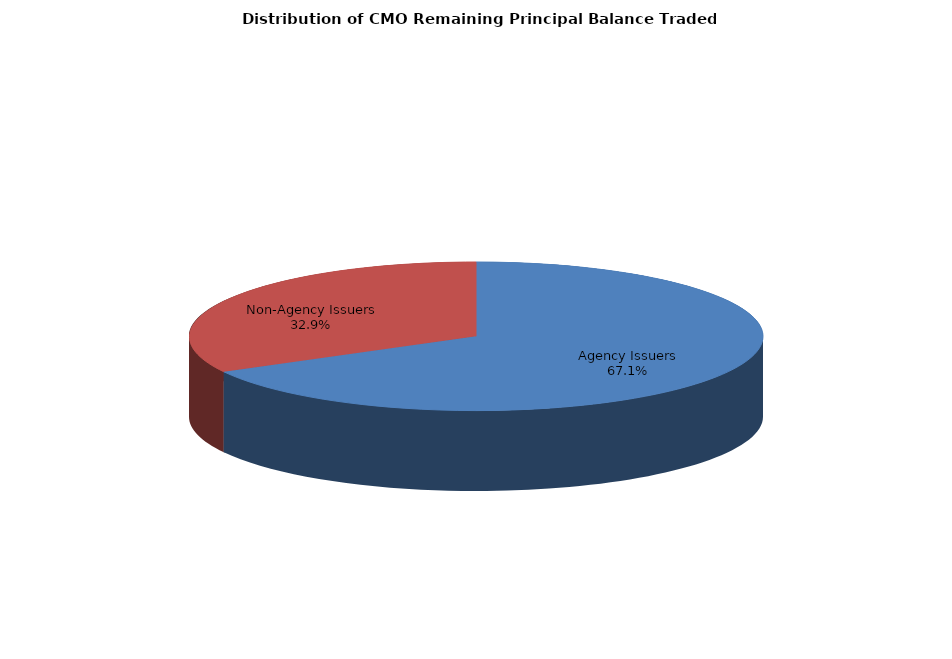
| Category | Series 0 |
|---|---|
| Agency Issuers | 5642684409.508 |
| Non-Agency Issuers | 2769356247.482 |